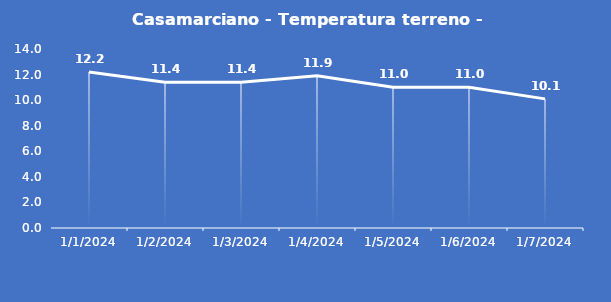
| Category | Casamarciano - Temperatura terreno - Grezzo (°C) |
|---|---|
| 1/1/24 | 12.2 |
| 1/2/24 | 11.4 |
| 1/3/24 | 11.4 |
| 1/4/24 | 11.9 |
| 1/5/24 | 11 |
| 1/6/24 | 11 |
| 1/7/24 | 10.1 |